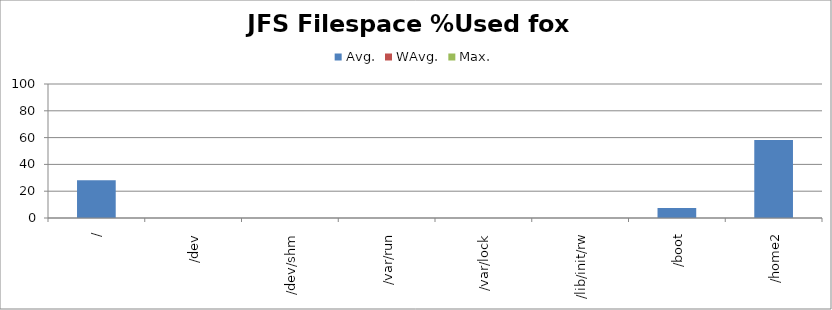
| Category | Avg. | WAvg. | Max. |
|---|---|---|---|
| / | 28.1 | 0 | 0 |
| /dev | 0 | 0 | 0 |
| /dev/shm | 0 | 0 | 0 |
| /var/run | 0 | 0 | 0 |
| /var/lock | 0 | 0 | 0 |
| /lib/init/rw | 0 | 0 | 0 |
| /boot | 7.5 | 0 | 0 |
| /home2 | 58.3 | 0 | 0 |